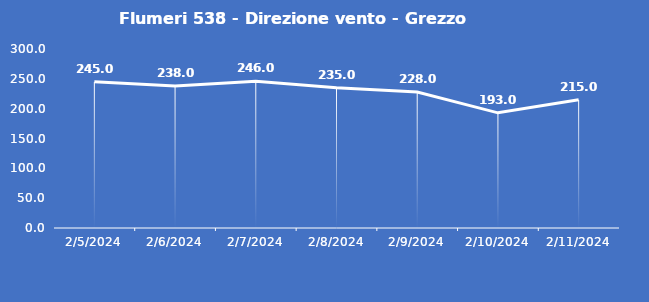
| Category | Flumeri 538 - Direzione vento - Grezzo (°N) |
|---|---|
| 2/5/24 | 245 |
| 2/6/24 | 238 |
| 2/7/24 | 246 |
| 2/8/24 | 235 |
| 2/9/24 | 228 |
| 2/10/24 | 193 |
| 2/11/24 | 215 |